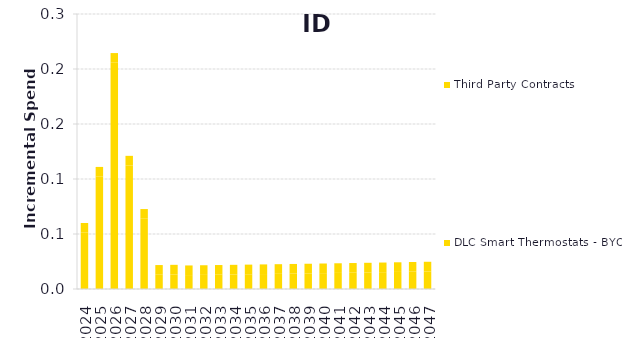
| Category | DLC Smart Thermostats - BYOT | Third Party Contracts |
|---|---|---|
| 2024.0 | 0.051 | 0.009 |
| 2025.0 | 0.102 | 0.009 |
| 2026.0 | 0.206 | 0.009 |
| 2027.0 | 0.112 | 0.009 |
| 2028.0 | 0.064 | 0.009 |
| 2029.0 | 0.013 | 0.009 |
| 2030.0 | 0.013 | 0.009 |
| 2031.0 | 0.013 | 0.009 |
| 2032.0 | 0.013 | 0.009 |
| 2033.0 | 0.013 | 0.009 |
| 2034.0 | 0.013 | 0.009 |
| 2035.0 | 0.013 | 0.009 |
| 2036.0 | 0.014 | 0.009 |
| 2037.0 | 0.014 | 0.009 |
| 2038.0 | 0.014 | 0.009 |
| 2039.0 | 0.014 | 0.009 |
| 2040.0 | 0.014 | 0.009 |
| 2041.0 | 0.015 | 0.009 |
| 2042.0 | 0.015 | 0.009 |
| 2043.0 | 0.015 | 0.009 |
| 2044.0 | 0.015 | 0.009 |
| 2045.0 | 0.016 | 0.009 |
| 2046.0 | 0.016 | 0.009 |
| 2047.0 | 0.016 | 0.009 |